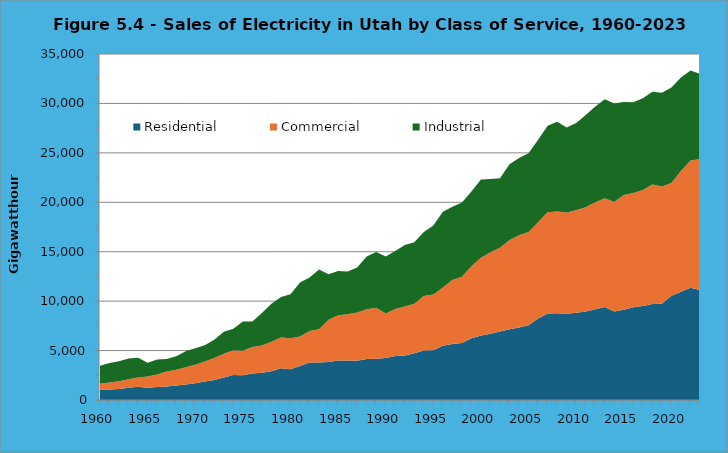
| Category | Residential | Commercial | Industrial |
|---|---|---|---|
| 1960 | 1012 | 640 | 1822 |
| 1961 | 1071 | 707 | 1960 |
| 1962 | 1125 | 777 | 2028 |
| 1963 | 1228 | 868 | 2111 |
| 1964 | 1331 | 955 | 1993 |
| 1965 | 1243 | 1128 | 1404 |
| 1966 | 1306 | 1274 | 1523 |
| 1967 | 1373 | 1498 | 1283 |
| 1968 | 1465 | 1607 | 1358 |
| 1969 | 1569 | 1748 | 1616 |
| 1970 | 1688 | 1890 | 1648 |
| 1971 | 1879 | 2028 | 1643 |
| 1972 | 2023 | 2226 | 1843 |
| 1973 | 2271 | 2416 | 2219 |
| 1974 | 2525 | 2516 | 2159 |
| 1975 | 2493 | 2479 | 2968 |
| 1976 | 2672 | 2697 | 2578 |
| 1977 | 2761 | 2749 | 3299 |
| 1978 | 2900 | 2990 | 3858 |
| 1979 | 3209 | 3106 | 4100 |
| 1980 | 3116 | 3141 | 4448 |
| 1981 | 3436 | 2999 | 5451 |
| 1982 | 3785 | 3207 | 5399 |
| 1983 | 3804 | 3350 | 6040 |
| 1984 | 3856 | 4269 | 4592 |
| 1985 | 3985 | 4596 | 4458 |
| 1986 | 3989 | 4682 | 4318 |
| 1987 | 3980 | 4863 | 4555 |
| 1988 | 4151 | 5035 | 5321 |
| 1989 | 4163 | 5173 | 5629 |
| 1990 | 4246.106 | 4514.613 | 5766.212 |
| 1991 | 4460.042 | 4733.977 | 5875.925 |
| 1992 | 4505.46 | 4955.704 | 6211.696 |
| 1993 | 4725.974 | 5019.969 | 6221.086 |
| 1994 | 5008.938 | 5499.542 | 6497.934 |
| 1995 | 5040.743 | 5642.481 | 6957.294 |
| 1996 | 5481.283 | 5911.25 | 7659.819 |
| 1997 | 5660.706 | 6469.491 | 7429.91 |
| 1998 | 5755.763 | 6708.937 | 7511.167 |
| 1999 | 6236.407 | 7282.205 | 7568.121 |
| 2000 | 6513.506 | 7884.214 | 7917.344 |
| 2001 | 6692.983 | 8262.123 | 7411.434 |
| 2002 | 6938.291 | 8462.993 | 7019.41 |
| 2003 | 7166.407 | 9023.642 | 7645.673 |
| 2004 | 7324.848 | 9345.111 | 7816.391 |
| 2005 | 7567.279 | 9416.776 | 7988.772 |
| 2006 | 8232.05 | 9748.79 | 8355.671 |
| 2007 | 8751.547 | 10240.612 | 8759.331 |
| 2008 | 8786.278 | 10286.114 | 9086.145 |
| 2009 | 8725.274 | 10235.285 | 8593.799 |
| 2010 | 8834.23 | 10367.847 | 8808.211 |
| 2011 | 8946.741 | 10544.326 | 9332.992 |
| 2012 | 9188.204 | 10802.8 | 9694.19 |
| 2013 | 9401.748 | 11007.765 | 10010.41 |
| 2014 | 8963.971 | 11053.251 | 9965.115 |
| 2015 | 9117.153 | 11614.593 | 9404.984 |
| 2016 | 9370.656 | 11565.312 | 9186.991 |
| 2017 | 9510.783 | 11739.121 | 9283.036 |
| 2018 | 9714.507 | 12083.833 | 9392.709 |
| 2019 | 9739.525 | 11860.449 | 9490.843 |
| 2020 | 10546.793 | 11395.032 | 9672.119 |
| 2021 | 10950.415 | 12206.51 | 9471.737 |
| 2022 | 11344.265 | 12870.552 | 9104.68 |
| 2023* | 11143 | 13214 | 8641 |